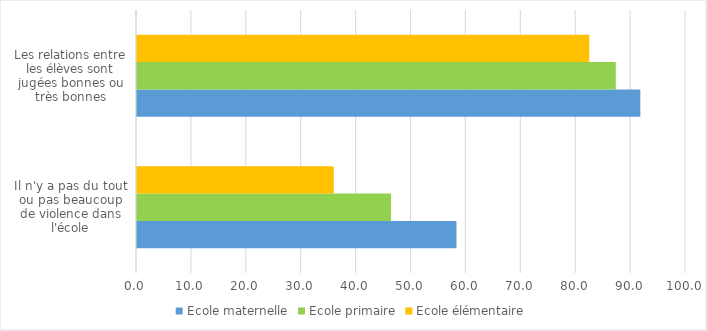
| Category | Ecole maternelle | Ecole primaire | Ecole élémentaire |
|---|---|---|---|
| Il n'y a pas du tout ou pas beaucoup de violence dans l'école | 58.19 | 46.273 | 35.838 |
| Les relations entre les élèves sont jugées bonnes ou très bonnes | 91.68 | 87.203 | 82.374 |